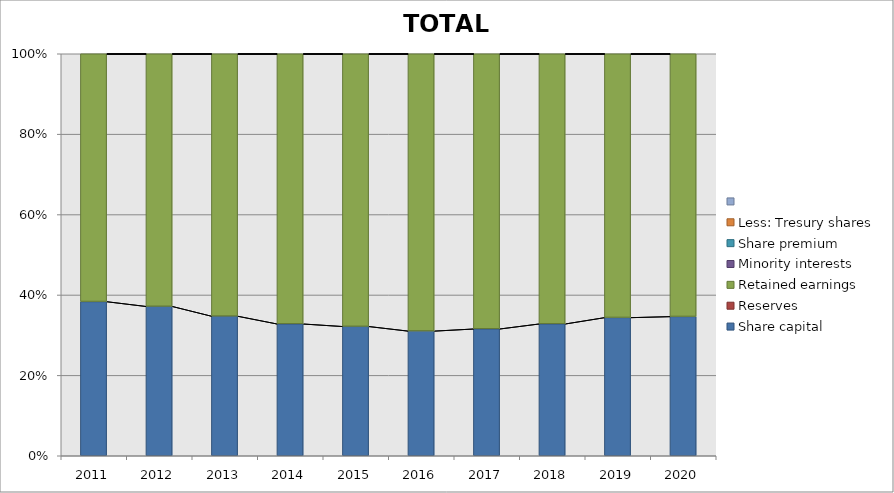
| Category | Share capital | Reserves | Retained earnings | Minority interests | Share premium | Less: Tresury shares | Series 6 |
|---|---|---|---|---|---|---|---|
| 2011.0 | 80000000 | 0 | 128478300 | 0 | 0 | 0 | 0 |
| 2012.0 | 80000000 | 0 | 135133353 | 0 | 0 | 0 | 0 |
| 2013.0 | 80000000 | 0 | 150182760 | 0 | 0 | 0 | 0 |
| 2014.0 | 80000000 | 0 | 163674425 | 0 | 0 | 0 | 0 |
| 2015.0 | 80000000 | 0 | 168432331 | 0 | 0 | 0 | 0 |
| 2016.0 | 80000000 | 0 | 177560582 | 0 | 0 | 0 | 0 |
| 2017.0 | 80000000 | 0 | 173250424 | 0 | 0 | 0 | 0 |
| 2018.0 | 80000000 | 0 | 163615822 | 0 | 0 | 0 | 0 |
| 2019.0 | 84325454 | 0 | 160715702 | 0 | 0 | 0 | 0 |
| 2020.0 | 84325454 | 0 | 158959853 | 0 | 0 | 0 | 0 |